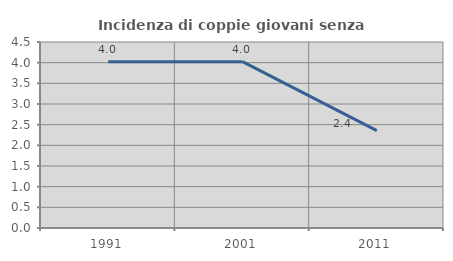
| Category | Incidenza di coppie giovani senza figli |
|---|---|
| 1991.0 | 4.021 |
| 2001.0 | 4.025 |
| 2011.0 | 2.354 |